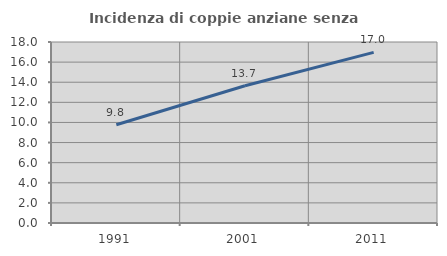
| Category | Incidenza di coppie anziane senza figli  |
|---|---|
| 1991.0 | 9.771 |
| 2001.0 | 13.651 |
| 2011.0 | 16.967 |